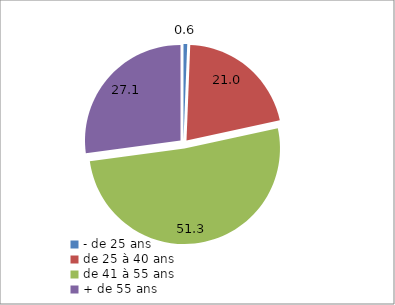
| Category | Series 0 |
|---|---|
| - de 25 ans | 0.625 |
| de 25 à 40 ans | 20.953 |
| de 41 à 55 ans | 51.306 |
| + de 55 ans | 27.116 |